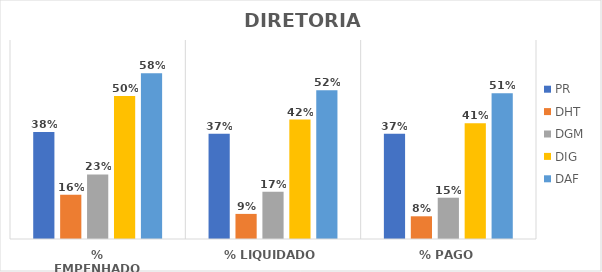
| Category | PR | DHT | DGM | DIG | DAF |
|---|---|---|---|---|---|
| % EMPENHADO | 0.377 | 0.155 | 0.227 | 0.503 | 0.583 |
| % LIQUIDADO | 0.37 | 0.088 | 0.166 | 0.42 | 0.523 |
| % PAGO | 0.37 | 0.08 | 0.145 | 0.407 | 0.513 |